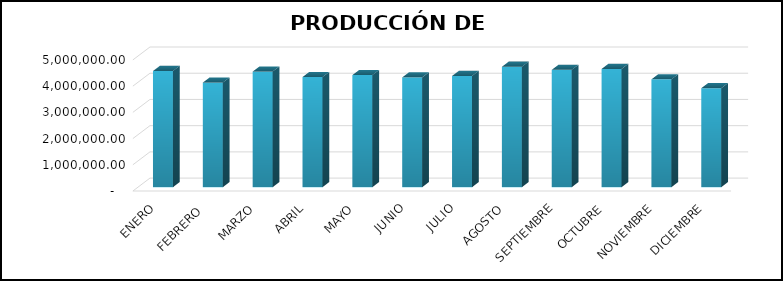
| Category | Series 0 |
|---|---|
| ENERO | 4427935.86 |
| FEBRERO  | 3987071.75 |
| MARZO | 4406873.95 |
| ABRIL | 4198220.9 |
| MAYO | 4271905.2 |
| JUNIO | 4183972 |
| JULIO | 4238773 |
| AGOSTO | 4590098 |
| SEPTIEMBRE | 4472265 |
| OCTUBRE | 4507669.5 |
| NOVIEMBRE | 4110347.6 |
| DICIEMBRE | 3773365.2 |